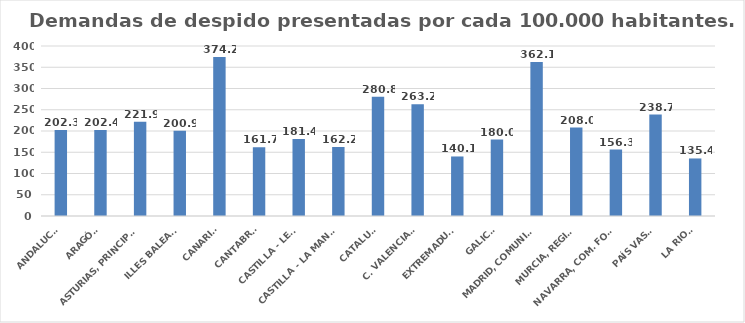
| Category | Series 0 |
|---|---|
| ANDALUCÍA | 202.31 |
| ARAGÓN | 202.449 |
| ASTURIAS, PRINCIPADO | 221.884 |
| ILLES BALEARS | 200.851 |
| CANARIAS | 374.193 |
| CANTABRIA | 161.675 |
| CASTILLA - LEÓN | 181.357 |
| CASTILLA - LA MANCHA | 162.181 |
| CATALUÑA | 280.755 |
| C. VALENCIANA | 263.219 |
| EXTREMADURA | 140.066 |
| GALICIA | 179.957 |
| MADRID, COMUNIDAD | 362.096 |
| MURCIA, REGIÓN | 207.97 |
| NAVARRA, COM. FORAL | 156.303 |
| PAÍS VASCO | 238.709 |
| LA RIOJA | 135.399 |